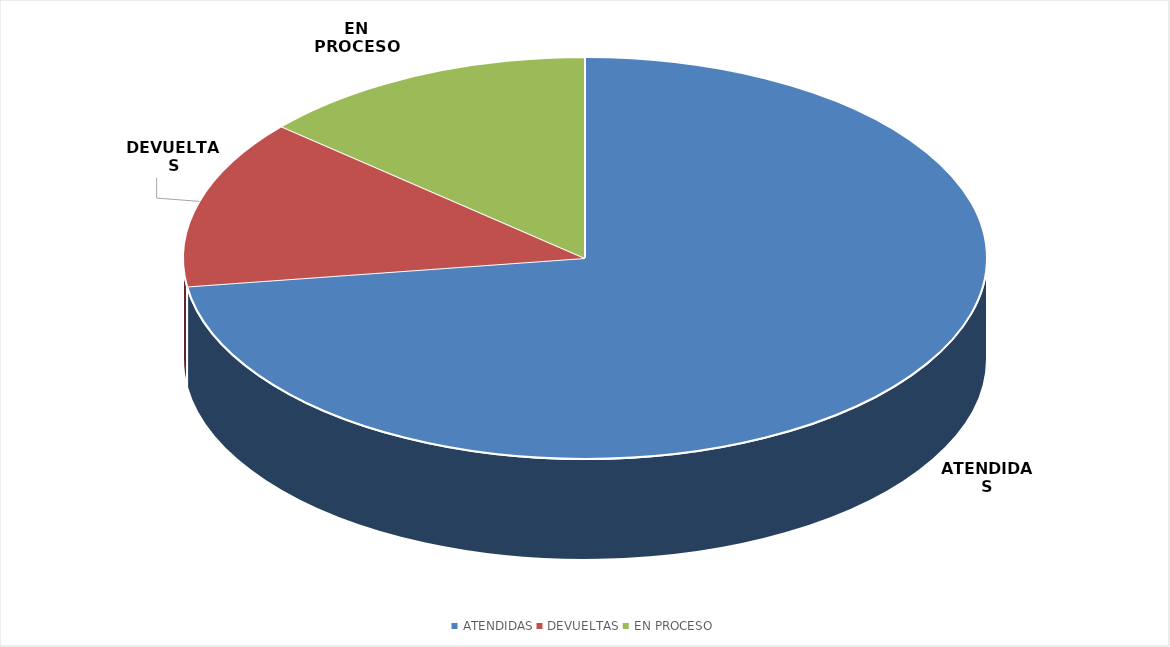
| Category | TOTAL |
|---|---|
| ATENDIDAS | 16 |
| DEVUELTAS | 3 |
| EN PROCESO | 3 |